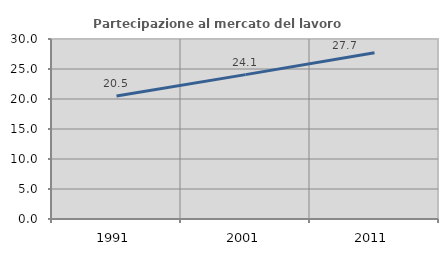
| Category | Partecipazione al mercato del lavoro  femminile |
|---|---|
| 1991.0 | 20.511 |
| 2001.0 | 24.064 |
| 2011.0 | 27.701 |